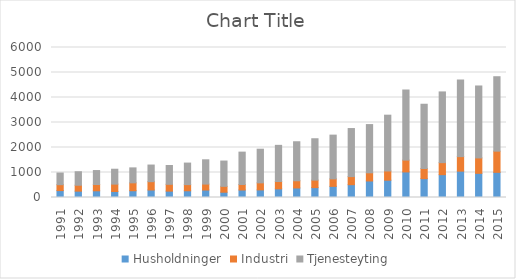
| Category | Husholdninger | Industri | Tjenesteyting |
|---|---|---|---|
| 1991.0 | 276 | 237 | 466 |
| 1992.0 | 254 | 237 | 540 |
| 1993.0 | 268 | 253 | 557 |
| 1994.0 | 240 | 295 | 596 |
| 1995.0 | 271 | 316 | 598 |
| 1996.0 | 300 | 333 | 665 |
| 1997.0 | 255 | 273 | 753 |
| 1998.0 | 269 | 247 | 861 |
| 1999.0 | 299 | 238 | 971 |
| 2000.0 | 211 | 235 | 1012 |
| 2001.0 | 300 | 219 | 1296 |
| 2002.0 | 304 | 282 | 1346 |
| 2003.0 | 346 | 295 | 1445 |
| 2004.0 | 381 | 289 | 1560 |
| 2005.0 | 395 | 300 | 1655 |
| 2006.0 | 445 | 301 | 1749 |
| 2007.0 | 512 | 324 | 1922 |
| 2008.0 | 661 | 326 | 1930 |
| 2009.0 | 692 | 369 | 2232 |
| 2010.0 | 1023 | 473 | 2804 |
| 2011.0 | 754 | 405 | 2571 |
| 2012.0 | 913 | 482 | 2828 |
| 2013.0 | 1054 | 581 | 3065 |
| 2014.0 | 967 | 616 | 2878 |
| 2015.0 | 1007 | 847 | 2977 |